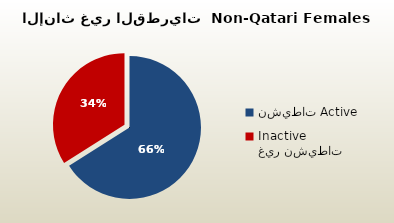
| Category | الاناث غير القطريات  Non-Qatari Females |
|---|---|
| نشيطات Active | 296528 |
| غير نشيطات Inactive | 152635 |